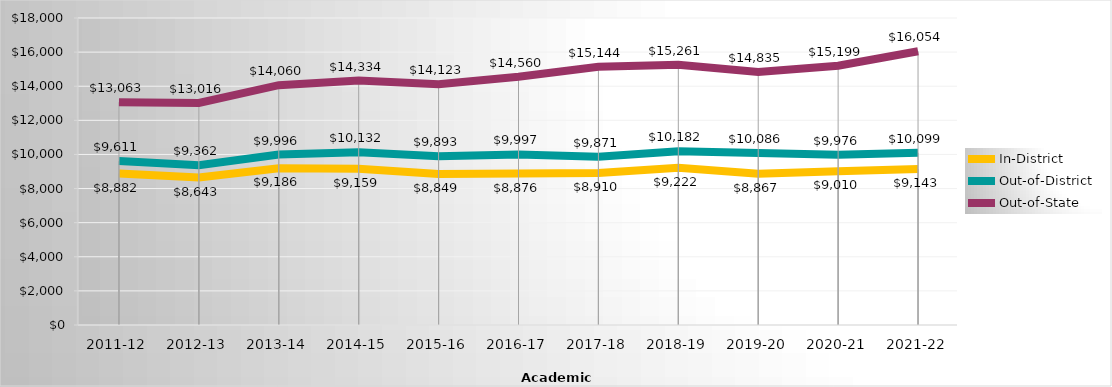
| Category | In-District | Out-of-District | Out-of-State |
|---|---|---|---|
| 2011-12 | 8882 | 9611 | 13063 |
| 2012-13 | 8643.15 | 9362 | 13016 |
| 2013-14 | 9185.83 | 9996.06 | 14060.13 |
| 2014-15 | 9159.04 | 10132.13 | 14333.65 |
| 2015-16 | 8849 | 9893 | 14123 |
| 2016-17 | 8876 | 9997 | 14560 |
| 2017-18 | 8910 | 9871 | 15144 |
| 2018-19 | 9222 | 10182 | 15261 |
| 2019-20 | 8867 | 10086 | 14835 |
| 2020-21 | 9010 | 9976 | 15199 |
| 2021-22 | 9143 | 10099 | 16054 |